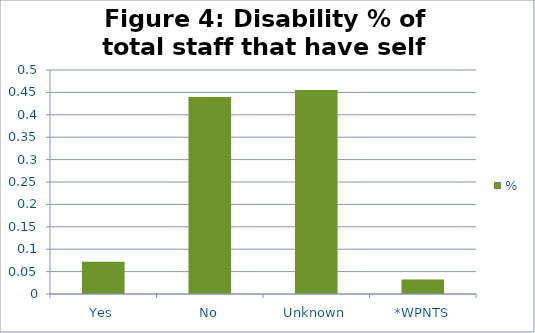
| Category | % |
|---|---|
| Yes | 0.072 |
| No | 0.44 |
| Unknown | 0.456 |
| *WPNTS | 0.033 |